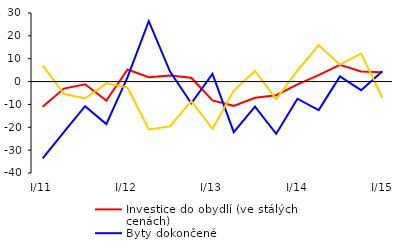
| Category | Investice do obydlí (ve stálých cenách) | Byty dokončené | Byty zahájené |
|---|---|---|---|
| I/11 | -11.054 | -33.558 | 7.127 |
| II | -3.081 | -22.078 | -5.371 |
| III | -1.199 | -10.775 | -7.391 |
| IV | -8.283 | -18.579 | -0.794 |
| I/12 | 5.265 | 1.931 | -2.59 |
| II | 1.92 | 26.442 | -20.954 |
| III | 2.619 | 4.368 | -19.623 |
| IV | 1.651 | -9.478 | -8.547 |
| I/13 | -8.255 | 3.387 | -20.596 |
| II | -10.619 | -22.129 | -3.915 |
| III | -7.118 | -10.934 | 4.641 |
|  IV | -5.948 | -22.874 | -7.63 |
|  I/14 | -1.193 | -7.499 | 4.849 |
| II | 2.802 | -12.486 | 15.883 |
| III | 7.332 | 2.244 | 7.397 |
| IV | 4.407 | -3.762 | 12.246 |
|  I/15 | 4.046 | 4.515 | -7.102 |